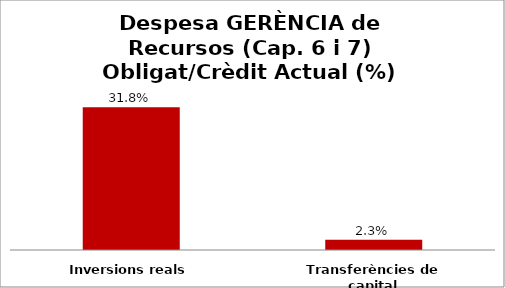
| Category | Series 0 |
|---|---|
| Inversions reals | 0.318 |
| Transferències de capital | 0.023 |